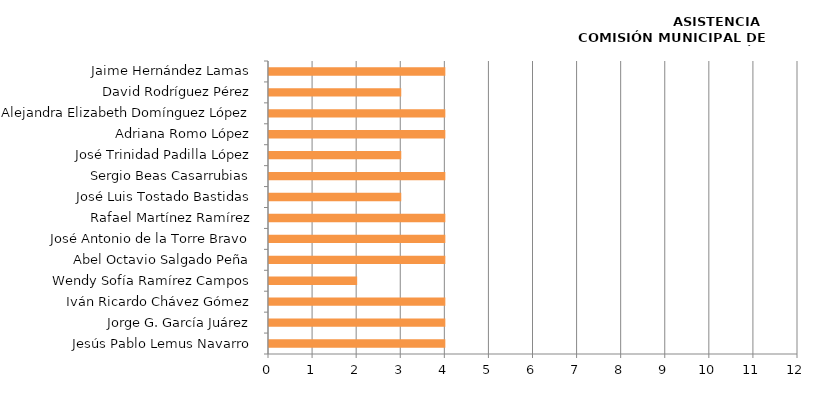
| Category | Series 0 |
|---|---|
| Jesús Pablo Lemus Navarro | 4 |
| Jorge G. García Juárez | 4 |
| Iván Ricardo Chávez Gómez | 4 |
| Wendy Sofía Ramírez Campos | 2 |
| Abel Octavio Salgado Peña | 4 |
| José Antonio de la Torre Bravo | 4 |
| Rafael Martínez Ramírez | 4 |
| José Luis Tostado Bastidas | 3 |
| Sergio Beas Casarrubias | 4 |
| José Trinidad Padilla López | 3 |
| Adriana Romo López | 4 |
| Alejandra Elizabeth Domínguez López | 4 |
| David Rodríguez Pérez | 3 |
| Jaime Hernández Lamas | 4 |